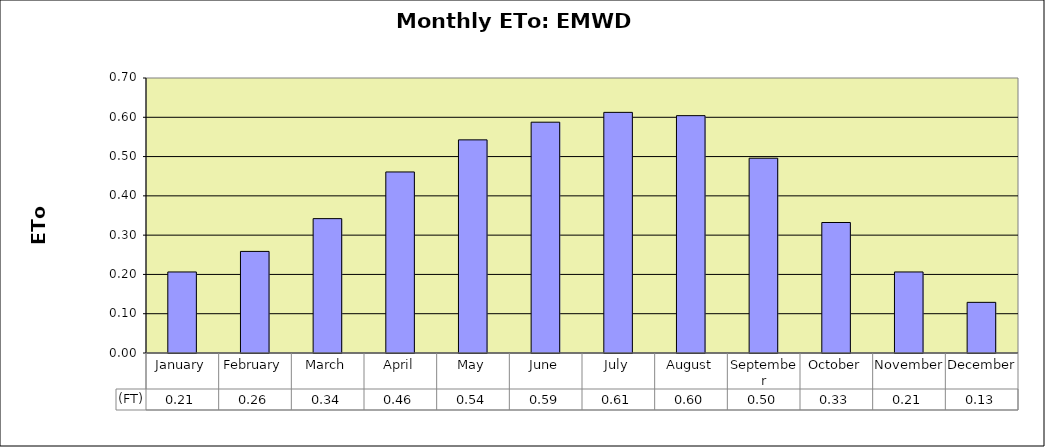
| Category | (FT) |
|---|---|
| January | 0.206 |
| February | 0.259 |
| March | 0.342 |
| April | 0.461 |
| May | 0.542 |
| June | 0.588 |
| July | 0.612 |
| August | 0.604 |
| September | 0.496 |
| October | 0.332 |
| November | 0.206 |
| December | 0.129 |